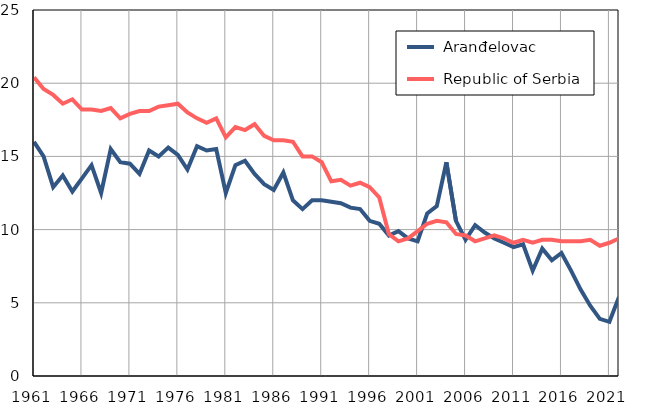
| Category |  Aranđelovac |  Republic of Serbia |
|---|---|---|
| 1961.0 | 16 | 20.4 |
| 1962.0 | 15 | 19.6 |
| 1963.0 | 12.9 | 19.2 |
| 1964.0 | 13.7 | 18.6 |
| 1965.0 | 12.6 | 18.9 |
| 1966.0 | 13.5 | 18.2 |
| 1967.0 | 14.4 | 18.2 |
| 1968.0 | 12.5 | 18.1 |
| 1969.0 | 15.5 | 18.3 |
| 1970.0 | 14.6 | 17.6 |
| 1971.0 | 14.5 | 17.9 |
| 1972.0 | 13.8 | 18.1 |
| 1973.0 | 15.4 | 18.1 |
| 1974.0 | 15 | 18.4 |
| 1975.0 | 15.6 | 18.5 |
| 1976.0 | 15.1 | 18.6 |
| 1977.0 | 14.1 | 18 |
| 1978.0 | 15.7 | 17.6 |
| 1979.0 | 15.4 | 17.3 |
| 1980.0 | 15.5 | 17.6 |
| 1981.0 | 12.5 | 16.3 |
| 1982.0 | 14.4 | 17 |
| 1983.0 | 14.7 | 16.8 |
| 1984.0 | 13.8 | 17.2 |
| 1985.0 | 13.1 | 16.4 |
| 1986.0 | 12.7 | 16.1 |
| 1987.0 | 13.9 | 16.1 |
| 1988.0 | 12 | 16 |
| 1989.0 | 11.4 | 15 |
| 1990.0 | 12 | 15 |
| 1991.0 | 12 | 14.6 |
| 1992.0 | 11.9 | 13.3 |
| 1993.0 | 11.8 | 13.4 |
| 1994.0 | 11.5 | 13 |
| 1995.0 | 11.4 | 13.2 |
| 1996.0 | 10.6 | 12.9 |
| 1997.0 | 10.4 | 12.2 |
| 1998.0 | 9.6 | 9.7 |
| 1999.0 | 9.9 | 9.2 |
| 2000.0 | 9.4 | 9.4 |
| 2001.0 | 9.2 | 9.9 |
| 2002.0 | 11.1 | 10.4 |
| 2003.0 | 11.6 | 10.6 |
| 2004.0 | 14.6 | 10.5 |
| 2005.0 | 10.6 | 9.7 |
| 2006.0 | 9.3 | 9.6 |
| 2007.0 | 10.3 | 9.2 |
| 2008.0 | 9.8 | 9.4 |
| 2009.0 | 9.4 | 9.6 |
| 2010.0 | 9.1 | 9.4 |
| 2011.0 | 8.8 | 9.1 |
| 2012.0 | 9 | 9.3 |
| 2013.0 | 7.2 | 9.1 |
| 2014.0 | 8.7 | 9.3 |
| 2015.0 | 7.9 | 9.3 |
| 2016.0 | 8.4 | 9.2 |
| 2017.0 | 7.2 | 9.2 |
| 2018.0 | 5.9 | 9.2 |
| 2019.0 | 4.8 | 9.3 |
| 2020.0 | 3.9 | 8.9 |
| 2021.0 | 3.7 | 9.1 |
| 2022.0 | 5.4 | 9.4 |